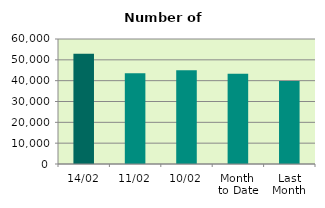
| Category | Series 0 |
|---|---|
| 14/02 | 52972 |
| 11/02 | 43514 |
| 10/02 | 44980 |
| Month 
to Date | 43329.6 |
| Last
Month | 39786.667 |